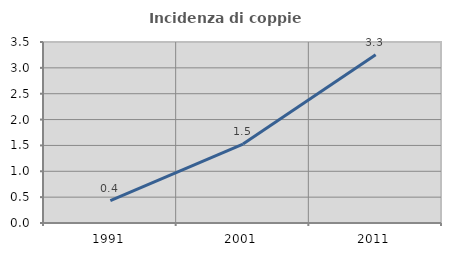
| Category | Incidenza di coppie miste |
|---|---|
| 1991.0 | 0.432 |
| 2001.0 | 1.526 |
| 2011.0 | 3.255 |